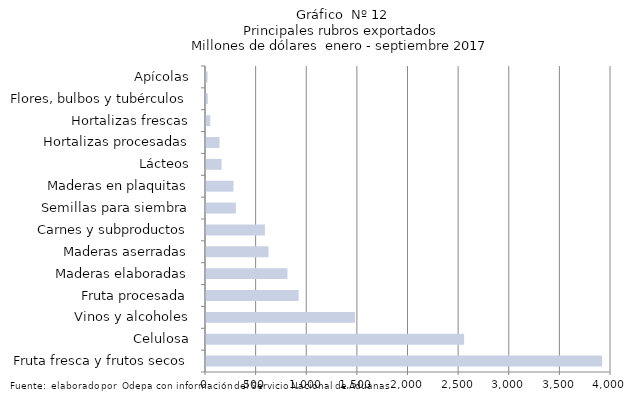
| Category | Series 7 |
|---|---|
| Fruta fresca y frutos secos | 3912137.781 |
| Celulosa | 2549235.914 |
| Vinos y alcoholes | 1471975.246 |
| Fruta procesada | 914830.209 |
| Maderas elaboradas | 804769.259 |
| Maderas aserradas | 617514.082 |
| Carnes y subproductos | 582098.037 |
| Semillas para siembra | 294938.469 |
| Maderas en plaquitas | 271446.876 |
| Lácteos | 153697.984 |
| Hortalizas procesadas | 134106.295 |
| Hortalizas frescas | 42389.853 |
| Flores, bulbos y tubérculos | 17628.744 |
| Apícolas | 15289.927 |